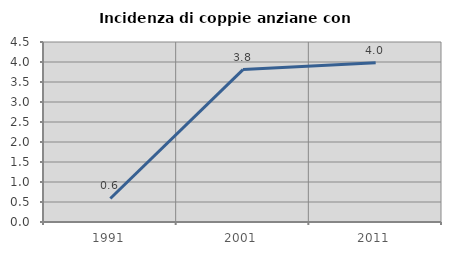
| Category | Incidenza di coppie anziane con figli |
|---|---|
| 1991.0 | 0.588 |
| 2001.0 | 3.81 |
| 2011.0 | 3.98 |